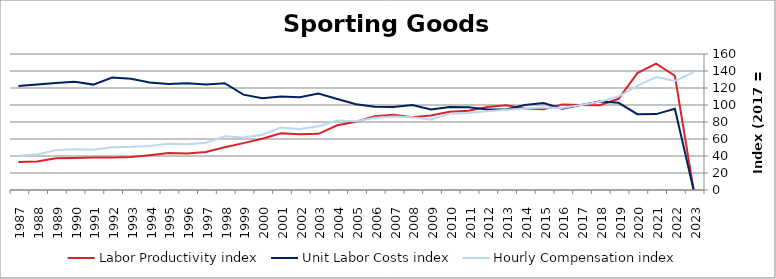
| Category | Labor Productivity index | Unit Labor Costs index | Hourly Compensation index |
|---|---|---|---|
| 2023.0 | 0 | 0 | 138.7 |
| 2022.0 | 134.405 | 95.534 | 128.402 |
| 2021.0 | 148.732 | 89.308 | 132.829 |
| 2020.0 | 137.477 | 89.196 | 122.624 |
| 2019.0 | 107.29 | 102.592 | 110.07 |
| 2018.0 | 99.829 | 104.07 | 103.892 |
| 2017.0 | 100 | 100 | 100 |
| 2016.0 | 100.73 | 95.703 | 96.402 |
| 2015.0 | 94.905 | 102.41 | 97.191 |
| 2014.0 | 95.905 | 99.903 | 95.812 |
| 2013.0 | 99.561 | 94.75 | 94.334 |
| 2012.0 | 97.738 | 94.719 | 92.576 |
| 2011.0 | 93.18 | 97.347 | 90.708 |
| 2010.0 | 91.996 | 97.642 | 89.826 |
| 2009.0 | 87.651 | 94.644 | 82.956 |
| 2008.0 | 85.532 | 99.945 | 85.485 |
| 2007.0 | 88.576 | 97.592 | 86.442 |
| 2006.0 | 86.783 | 97.84 | 84.909 |
| 2005.0 | 80.317 | 100.882 | 81.025 |
| 2004.0 | 76.214 | 107.144 | 81.659 |
| 2003.0 | 66.049 | 113.461 | 74.94 |
| 2002.0 | 65.678 | 109.131 | 71.676 |
| 2001.0 | 66.826 | 110.006 | 73.513 |
| 2000.0 | 60.347 | 107.829 | 65.072 |
| 1999.0 | 55.144 | 112.166 | 61.853 |
| 1998.0 | 50.359 | 125.651 | 63.277 |
| 1997.0 | 44.787 | 124.167 | 55.611 |
| 1996.0 | 42.894 | 125.443 | 53.807 |
| 1995.0 | 43.565 | 124.685 | 54.319 |
| 1994.0 | 40.962 | 126.543 | 51.834 |
| 1993.0 | 38.736 | 131.002 | 50.745 |
| 1992.0 | 38.144 | 132.207 | 50.429 |
| 1991.0 | 38.204 | 123.988 | 47.368 |
| 1990.0 | 37.654 | 127.343 | 47.95 |
| 1989.0 | 37.241 | 125.966 | 46.912 |
| 1988.0 | 33.586 | 124.11 | 41.684 |
| 1987.0 | 32.95 | 122.288 | 40.294 |